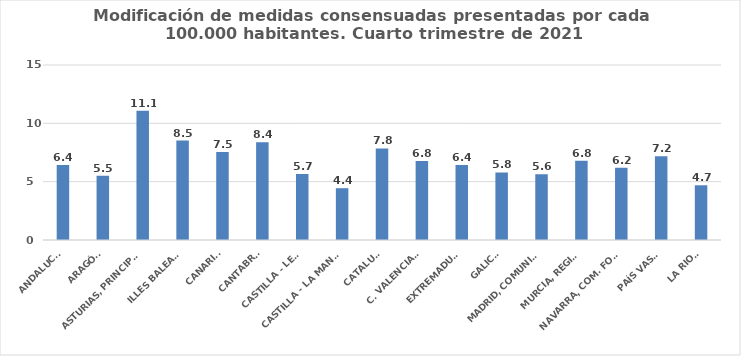
| Category | Series 0 |
|---|---|
| ANDALUCÍA | 6.422 |
| ARAGÓN | 5.504 |
| ASTURIAS, PRINCIPADO | 11.069 |
| ILLES BALEARS | 8.525 |
| CANARIAS | 7.547 |
| CANTABRIA | 8.383 |
| CASTILLA - LEÓN | 5.665 |
| CASTILLA - LA MANCHA | 4.44 |
| CATALUÑA | 7.845 |
| C. VALENCIANA | 6.781 |
| EXTREMADURA | 6.418 |
| GALICIA | 5.787 |
| MADRID, COMUNIDAD | 5.643 |
| MURCIA, REGIÓN | 6.783 |
| NAVARRA, COM. FORAL | 6.198 |
| PAÍS VASCO | 7.182 |
| LA RIOJA | 4.69 |